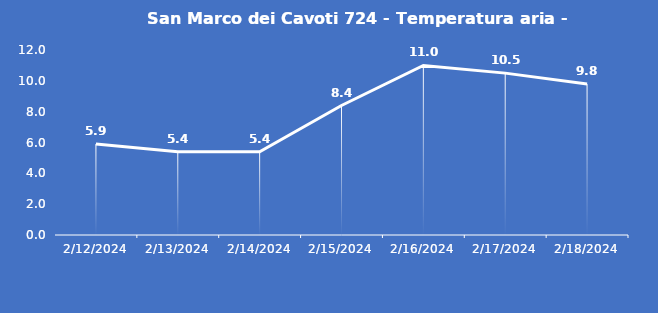
| Category | San Marco dei Cavoti 724 - Temperatura aria - Grezzo (°C) |
|---|---|
| 2/12/24 | 5.9 |
| 2/13/24 | 5.4 |
| 2/14/24 | 5.4 |
| 2/15/24 | 8.4 |
| 2/16/24 | 11 |
| 2/17/24 | 10.5 |
| 2/18/24 | 9.8 |